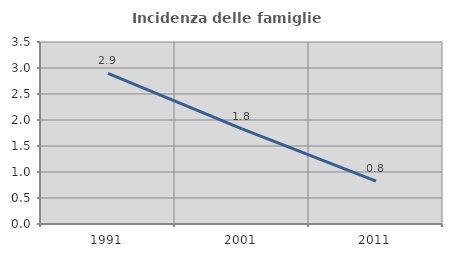
| Category | Incidenza delle famiglie numerose |
|---|---|
| 1991.0 | 2.895 |
| 2001.0 | 1.831 |
| 2011.0 | 0.825 |